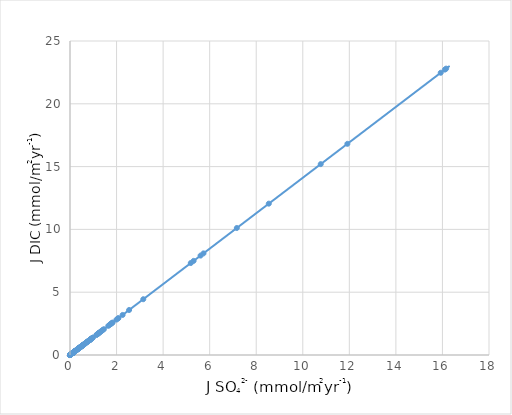
| Category | TOTAL DIC |
|---|---|
| 16.159 | 22.8 |
| 16.105 | 22.723 |
| 15.926 | 22.471 |
| 11.916 | 16.813 |
| 10.771 | 15.197 |
| 8.54 | 12.05 |
| 7.166 | 10.111 |
| 5.735 | 8.092 |
| 5.609 | 7.914 |
| 5.311 | 7.494 |
| 5.188 | 7.32 |
| 3.148 | 4.442 |
| 2.539 | 3.582 |
| 2.26 | 3.189 |
| 2.078 | 2.932 |
| 2.061 | 2.908 |
| 1.998 | 2.819 |
| 1.831 | 2.583 |
| 1.798 | 2.537 |
| 1.782 | 2.514 |
| 1.744 | 2.461 |
| 1.715 | 2.42 |
| 1.714 | 2.418 |
| 1.645 | 2.321 |
| 1.455 | 2.053 |
| 1.412 | 1.992 |
| 1.393 | 1.965 |
| 1.33 | 1.877 |
| 1.329 | 1.875 |
| 1.278 | 1.803 |
| 1.249 | 1.762 |
| 1.229 | 1.734 |
| 1.217 | 1.717 |
| 1.209 | 1.706 |
| 1.191 | 1.68 |
| 1.174 | 1.656 |
| 1.161 | 1.638 |
| 1.159 | 1.635 |
| 1.139 | 1.607 |
| 0.99 | 1.397 |
| 0.956 | 1.349 |
| 0.944 | 1.332 |
| 0.937 | 1.322 |
| 0.91 | 1.284 |
| 0.9 | 1.27 |
| 0.886 | 1.25 |
| 0.876 | 1.236 |
| 0.872 | 1.23 |
| 0.87 | 1.228 |
| 0.855 | 1.206 |
| 0.85 | 1.199 |
| 0.841 | 1.187 |
| 0.84 | 1.185 |
| 0.824 | 1.163 |
| 0.795 | 1.122 |
| 0.791 | 1.116 |
| 0.782 | 1.103 |
| 0.769 | 1.085 |
| 0.753 | 1.062 |
| 0.733 | 1.034 |
| 0.722 | 1.019 |
| 0.722 | 1.019 |
| 0.706 | 0.996 |
| 0.661 | 0.933 |
| 0.658 | 0.928 |
| 0.653 | 0.921 |
| 0.642 | 0.906 |
| 0.638 | 0.9 |
| 0.63 | 0.889 |
| 0.625 | 0.882 |
| 0.617 | 0.871 |
| 0.613 | 0.865 |
| 0.61 | 0.861 |
| 0.601 | 0.848 |
| 0.567 | 0.8 |
| 0.555 | 0.783 |
| 0.554 | 0.782 |
| 0.552 | 0.779 |
| 0.538 | 0.759 |
| 0.533 | 0.752 |
| 0.53 | 0.748 |
| 0.522 | 0.737 |
| 0.522 | 0.737 |
| 0.522 | 0.737 |
| 0.513 | 0.724 |
| 0.512 | 0.722 |
| 0.512 | 0.722 |
| 0.496 | 0.7 |
| 0.495 | 0.698 |
| 0.493 | 0.696 |
| 0.49 | 0.691 |
| 0.483 | 0.681 |
| 0.476 | 0.672 |
| 0.473 | 0.667 |
| 0.468 | 0.66 |
| 0.466 | 0.658 |
| 0.464 | 0.655 |
| 0.461 | 0.65 |
| 0.46 | 0.649 |
| 0.456 | 0.643 |
| 0.451 | 0.636 |
| 0.449 | 0.634 |
| 0.427 | 0.602 |
| 0.423 | 0.597 |
| 0.422 | 0.595 |
| 0.421 | 0.594 |
| 0.417 | 0.588 |
| 0.416 | 0.587 |
| 0.403 | 0.569 |
| 0.402 | 0.567 |
| 0.399 | 0.563 |
| 0.398 | 0.562 |
| 0.397 | 0.56 |
| 0.396 | 0.559 |
| 0.394 | 0.556 |
| 0.386 | 0.545 |
| 0.386 | 0.545 |
| 0.385 | 0.543 |
| 0.377 | 0.532 |
| 0.377 | 0.532 |
| 0.374 | 0.528 |
| 0.37 | 0.522 |
| 0.364 | 0.514 |
| 0.363 | 0.512 |
| 0.353 | 0.498 |
| 0.345 | 0.487 |
| 0.337 | 0.475 |
| 0.336 | 0.474 |
| 0.332 | 0.468 |
| 0.325 | 0.459 |
| 0.319 | 0.45 |
| 0.318 | 0.449 |
| 0.306 | 0.432 |
| 0.293 | 0.413 |
| 0.291 | 0.411 |
| 0.284 | 0.401 |
| 0.281 | 0.396 |
| 0.272 | 0.384 |
| 0.269 | 0.38 |
| 0.269 | 0.38 |
| 0.268 | 0.378 |
| 0.265 | 0.374 |
| 0.258 | 0.364 |
| 0.257 | 0.363 |
| 0.256 | 0.361 |
| 0.243 | 0.343 |
| 0.236 | 0.333 |
| 0.235 | 0.332 |
| 0.232 | 0.327 |
| 0.232 | 0.327 |
| 0.227 | 0.32 |
| 0.225 | 0.317 |
| 0.225 | 0.317 |
| 0.222 | 0.313 |
| 0.22 | 0.31 |
| 0.216 | 0.305 |
| 0.208 | 0.293 |
| 0.206 | 0.291 |
| 0.206 | 0.291 |
| 0.204 | 0.288 |
| 0.203 | 0.286 |
| 0.201 | 0.284 |
| 0.201 | 0.284 |
| 0.196 | 0.277 |
| 0.196 | 0.277 |
| 0.196 | 0.277 |
| 0.196 | 0.277 |
| 0.19 | 0.268 |
| 0.189 | 0.267 |
| 0.187 | 0.264 |
| 0.187 | 0.264 |
| 0.185 | 0.261 |
| 0.184 | 0.26 |
| 0.18 | 0.254 |
| 0.179 | 0.253 |
| 0.178 | 0.251 |
| 0.177 | 0.25 |
| 0.175 | 0.247 |
| 0.17 | 0.24 |
| 0.168 | 0.237 |
| 0.168 | 0.237 |
| 0.167 | 0.236 |
| 0.163 | 0.23 |
| 0.16 | 0.226 |
| 0.159 | 0.224 |
| 0.159 | 0.224 |
| 0.158 | 0.223 |
| 0.153 | 0.216 |
| 0.153 | 0.216 |
| 0.151 | 0.213 |
| 0.149 | 0.21 |
| 0.149 | 0.21 |
| 0.149 | 0.21 |
| 0.148 | 0.209 |
| 0.145 | 0.205 |
| 0.144 | 0.203 |
| 0.144 | 0.203 |
| 0.143 | 0.202 |
| 0.14 | 0.198 |
| 0.14 | 0.198 |
| 0.14 | 0.198 |
| 0.14 | 0.198 |
| 0.139 | 0.196 |
| 0.137 | 0.193 |
| 0.134 | 0.189 |
| 0.132 | 0.186 |
| 0.132 | 0.186 |
| 0.132 | 0.186 |
| 0.131 | 0.185 |
| 0.131 | 0.185 |
| 0.129 | 0.182 |
| 0.128 | 0.181 |
| 0.126 | 0.178 |
| 0.125 | 0.176 |
| 0.124 | 0.175 |
| 0.124 | 0.175 |
| 0.123 | 0.174 |
| 0.123 | 0.174 |
| 0.121 | 0.171 |
| 0.121 | 0.171 |
| 0.121 | 0.171 |
| 0.12 | 0.169 |
| 0.119 | 0.168 |
| 0.119 | 0.168 |
| 0.119 | 0.168 |
| 0.116 | 0.164 |
| 0.116 | 0.164 |
| 0.116 | 0.164 |
| 0.115 | 0.162 |
| 0.115 | 0.162 |
| 0.115 | 0.162 |
| 0.114 | 0.161 |
| 0.114 | 0.161 |
| 0.113 | 0.159 |
| 0.113 | 0.159 |
| 0.113 | 0.159 |
| 0.113 | 0.159 |
| 0.109 | 0.154 |
| 0.109 | 0.154 |
| 0.108 | 0.152 |
| 0.107 | 0.151 |
| 0.107 | 0.151 |
| 0.106 | 0.15 |
| 0.104 | 0.147 |
| 0.104 | 0.147 |
| 0.103 | 0.145 |
| 0.102 | 0.144 |
| 0.1 | 0.141 |
| 0.0995 | 0.14 |
| 0.0934 | 0.132 |
| 0.0932 | 0.132 |
| 0.0929 | 0.131 |
| 0.0875 | 0.123 |
| 0.0855 | 0.121 |
| 0.0854 | 0.12 |
| 0.0849 | 0.12 |
| 0.0849 | 0.12 |
| 0.0835 | 0.118 |
| 0.0834 | 0.118 |
| 0.0831 | 0.117 |
| 0.0818 | 0.115 |
| 0.0817 | 0.115 |
| 0.0815 | 0.115 |
| 0.0812 | 0.115 |
| 0.0795 | 0.112 |
| 0.0792 | 0.112 |
| 0.0789 | 0.111 |
| 0.0786 | 0.111 |
| 0.078 | 0.11 |
| 0.0775 | 0.109 |
| 0.0772 | 0.109 |
| 0.0771 | 0.109 |
| 0.077 | 0.109 |
| 0.0765 | 0.108 |
| 0.0754 | 0.106 |
| 0.0753 | 0.106 |
| 0.0748 | 0.106 |
| 0.0735 | 0.104 |
| 0.073 | 0.103 |
| 0.0719 | 0.101 |
| 0.0685 | 0.097 |
| 0.0675 | 0.095 |
| 0.0669 | 0.094 |
| 0.0668 | 0.094 |
| 0.0665 | 0.094 |
| 0.0661 | 0.093 |
| 0.0657 | 0.093 |
| 0.065 | 0.092 |
| 0.065 | 0.092 |
| 0.0636 | 0.09 |
| 0.0635 | 0.09 |
| 0.0632 | 0.089 |
| 0.0629 | 0.089 |
| 0.0627 | 0.088 |
| 0.0623 | 0.088 |
| 0.0618 | 0.087 |
| 0.0612 | 0.086 |
| 0.0609 | 0.086 |
| 0.0598 | 0.084 |
| 0.0598 | 0.084 |
| 0.0591 | 0.083 |
| 0.059 | 0.083 |
| 0.0585 | 0.083 |
| 0.0584 | 0.082 |
| 0.0583 | 0.082 |
| 0.0582 | 0.082 |
| 0.058 | 0.082 |
| 0.0575 | 0.081 |
| 0.057 | 0.08 |
| 0.0558 | 0.079 |
| 0.0557 | 0.079 |
| 0.055 | 0.078 |
| 0.0545 | 0.077 |
| 0.0528 | 0.074 |
| 0.052 | 0.073 |
| 0.0516 | 0.073 |
| 0.0505 | 0.071 |
| 0.0499 | 0.07 |
| 0.0498 | 0.07 |
| 0.0492 | 0.069 |
| 0.0491 | 0.069 |
| 0.0476 | 0.067 |
| 0.0469 | 0.066 |
| 0.0466 | 0.066 |
| 0.0462 | 0.065 |
| 0.0442 | 0.062 |
| 0.0438 | 0.062 |
| 0.0433 | 0.061 |
| 0.0431 | 0.061 |
| 0.0415 | 0.059 |
| 0.041 | 0.058 |
| 0.0409 | 0.058 |
| 0.0399 | 0.056 |
| 0.0396 | 0.056 |
| 0.0389 | 0.055 |
| 0.0383 | 0.054 |
| 0.0382 | 0.054 |
| 0.038 | 0.054 |
| 0.0375 | 0.053 |
| 0.0371 | 0.052 |
| 0.0369 | 0.052 |
| 0.0368 | 0.052 |
| 0.0364 | 0.051 |
| 0.0346 | 0.049 |
| 0.0344 | 0.049 |
| 0.0343 | 0.048 |
| 0.0342 | 0.048 |
| 0.034 | 0.048 |
| 0.0338 | 0.048 |
| 0.0335 | 0.047 |
| 0.0326 | 0.046 |
| 0.0317 | 0.045 |
| 0.0316 | 0.045 |
| 0.031 | 0.044 |
| 0.0302 | 0.043 |
| 0.03 | 0.042 |
| 0.0293 | 0.041 |
| 0.0285 | 0.04 |
| 0.0282 | 0.04 |
| 0.0282 | 0.04 |
| 0.028 | 0.04 |
| 0.0278 | 0.039 |
| 0.0277 | 0.039 |
| 0.0272 | 0.038 |
| 0.027 | 0.038 |
| 0.0268 | 0.038 |
| 0.0259 | 0.037 |
| 0.0256 | 0.036 |
| 0.0255 | 0.036 |
| 0.0254 | 0.036 |
| 0.0254 | 0.036 |
| 0.0248 | 0.035 |
| 0.0248 | 0.035 |
| 0.0242 | 0.034 |
| 0.0238 | 0.034 |
| 0.0235 | 0.033 |
| 0.0226 | 0.032 |
| 0.0224 | 0.032 |
| 0.0222 | 0.031 |
| 0.0222 | 0.031 |
| 0.0217 | 0.031 |
| 0.0206 | 0.029 |
| 0.02 | 0.028 |
| 0.0197 | 0.028 |
| 0.0193 | 0.027 |
| 0.019 | 0.027 |
| 0.0188 | 0.027 |
| 0.0187 | 0.026 |
| 0.0185 | 0.026 |
| 0.0185 | 0.026 |
| 0.0185 | 0.026 |
| 0.0173 | 0.024 |
| 0.0168 | 0.024 |
| 0.0166 | 0.023 |
| 0.0165 | 0.023 |
| 0.0162 | 0.023 |
| 0.0153 | 0.022 |
| 0.0149 | 0.021 |
| 0.0148 | 0.021 |
| 0.0142 | 0.02 |
| 0.0138 | 0.019 |
| 0.0136 | 0.019 |
| 0.0133 | 0.019 |
| 0.0132 | 0.019 |
| 0.0126 | 0.018 |
| 0.0123 | 0.017 |
| 0.0118 | 0.017 |
| 0.0117 | 0.017 |
| 0.0114 | 0.016 |
| 0.0109 | 0.015 |
| 0.0109 | 0.015 |
| 0.0107 | 0.015 |
| 0.0107 | 0.015 |
| 0.0103 | 0.015 |
| 0.0099 | 0.014 |
| 0.00979 | 0.014 |
| 0.00931 | 0.013 |
| 0.00929 | 0.013 |
| 0.0091 | 0.013 |
| 0.00892 | 0.013 |
| 0.00889 | 0.013 |
| 0.00889 | 0.013 |
| 0.00873 | 0.012 |
| 0.00867 | 0.012 |
| 0.00817 | 0.012 |
| 0.008 | 0.011 |
| 0.00792 | 0.011 |
| 0.00756 | 0.011 |
| 0.00755 | 0.011 |
| 0.00754 | 0.011 |
| 0.00727 | 0.01 |
| 0.00714 | 0.01 |
| 0.00703 | 0.01 |
| 0.00691 | 0.01 |
| 0.00689 | 0.01 |
| 0.00675 | 0.01 |
| 0.00667 | 0.009 |
| 0.00645 | 0.009 |
| 0.00624 | 0.009 |
| 0.00591 | 0.008 |
| 0.00566 | 0.008 |
| 0.0055 | 0.008 |
| 0.00521 | 0.007 |
| 0.00504 | 0.007 |
| 0.00494 | 0.007 |
| 0.00488 | 0.007 |
| 0.00472 | 0.007 |
| 0.00465 | 0.007 |
| 0.00438 | 0.006 |
| 0.00433 | 0.006 |
| 0.0043 | 0.006 |
| 0.00419 | 0.006 |
| 0.00412 | 0.006 |
| 0.00411 | 0.006 |
| 0.00368 | 0.005 |
| 0.00367 | 0.005 |
| 0.00361 | 0.005 |
| 0.00327 | 0.005 |
| 0.00326 | 0.005 |
| 0.00326 | 0.005 |
| 0.00317 | 0.004 |
| 0.00314 | 0.004 |
| 0.00274 | 0.004 |
| 0.00257 | 0.004 |
| 0.00222 | 0.003 |
| 0.0022 | 0.003 |
| 0.00217 | 0.003 |
| 0.00212 | 0.003 |
| 0.00204 | 0.003 |
| 0.00202 | 0.003 |
| 0.00197 | 0.003 |
| 0.0019 | 0.003 |
| 0.00189 | 0.003 |
| 0.00177 | 0.002 |
| 0.00177 | 0.002 |
| 0.00168 | 0.002 |
| 0.00165 | 0.002 |
| 0.001554 | 0.002 |
| 0.00155 | 0.002 |
| 0.00152 | 0.002 |
| 0.0015 | 0.002 |
| 0.00141 | 0.002 |
| 0.00137 | 0.002 |
| 0.0013 | 0.002 |
| 0.00127 | 0.002 |
| 0.00124 | 0.002 |
| 0.00118 | 0.002 |
| 0.00115 | 0.002 |
| 0.00102 | 0.001 |
| 0.00101 | 0.001 |
| 0.000897 | 0.001 |
| 0.000813 | 0.001 |
| 0.000807 | 0.001 |
| 0.000762 | 0.001 |
| 0.000726 | 0.001 |
| 0.000718 | 0.001 |
| 0.000533 | 0.001 |
| 0.000529 | 0.001 |
| 0.000422 | 0.001 |
| 0.000412 | 0.001 |
| 0.000355 | 0.001 |
| 0.00034 | 0 |
| 0.0003 | 0 |
| 0.000271 | 0 |
| 0.000268 | 0 |
| 0.000256 | 0 |
| 0.000234 | 0 |
| 0.000181 | 0 |
| 0.000154 | 0 |